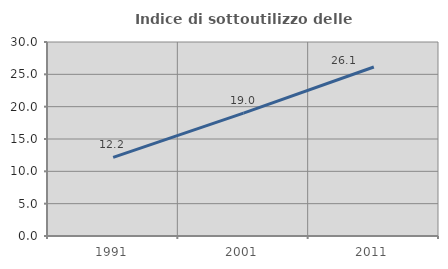
| Category | Indice di sottoutilizzo delle abitazioni  |
|---|---|
| 1991.0 | 12.162 |
| 2001.0 | 19.011 |
| 2011.0 | 26.132 |